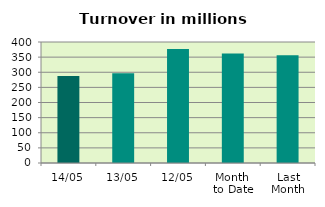
| Category | Series 0 |
|---|---|
| 14/05 | 287.486 |
| 13/05 | 296.43 |
| 12/05 | 377.084 |
| Month 
to Date | 362.239 |
| Last
Month | 356.105 |